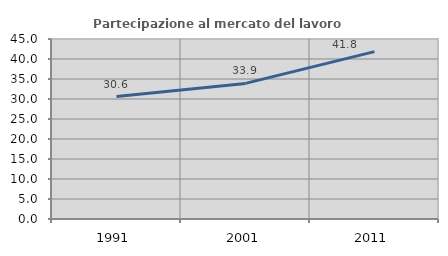
| Category | Partecipazione al mercato del lavoro  femminile |
|---|---|
| 1991.0 | 30.601 |
| 2001.0 | 33.898 |
| 2011.0 | 41.848 |